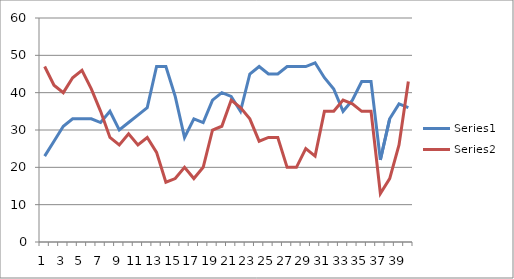
| Category | Series 0 | Series 1 |
|---|---|---|
| 0 | 23 | 47 |
| 1 | 27 | 42 |
| 2 | 31 | 40 |
| 3 | 33 | 44 |
| 4 | 33 | 46 |
| 5 | 33 | 41 |
| 6 | 32 | 35 |
| 7 | 35 | 28 |
| 8 | 30 | 26 |
| 9 | 32 | 29 |
| 10 | 34 | 26 |
| 11 | 36 | 28 |
| 12 | 47 | 24 |
| 13 | 47 | 16 |
| 14 | 39 | 17 |
| 15 | 28 | 20 |
| 16 | 33 | 17 |
| 17 | 32 | 20 |
| 18 | 38 | 30 |
| 19 | 40 | 31 |
| 20 | 39 | 38 |
| 21 | 35 | 36 |
| 22 | 45 | 33 |
| 23 | 47 | 27 |
| 24 | 45 | 28 |
| 25 | 45 | 28 |
| 26 | 47 | 20 |
| 27 | 47 | 20 |
| 28 | 47 | 25 |
| 29 | 48 | 23 |
| 30 | 44 | 35 |
| 31 | 41 | 35 |
| 32 | 35 | 38 |
| 33 | 38 | 37 |
| 34 | 43 | 35 |
| 35 | 43 | 35 |
| 36 | 22 | 13 |
| 37 | 33 | 17 |
| 38 | 37 | 26 |
| 39 | 36 | 43 |